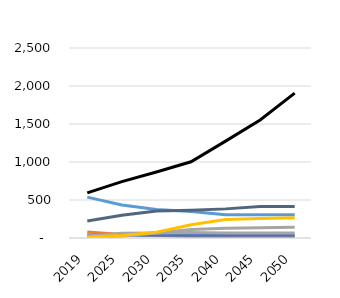
| Category | liquids | natural gas | coal | nuclear | hydro | other | wind | solar |
|---|---|---|---|---|---|---|---|---|
| 2019.0 | 77.92 | 538.19 | 593.2 | 37.21 | 224.79 | 26.84 | 9.54 | 11.95 |
| 2025.0 | 47.72 | 433.59 | 741.6 | 37.27 | 298.81 | 61.18 | 23.06 | 32.98 |
| 2030.0 | 31.63 | 375.12 | 868.62 | 37.27 | 355.27 | 65.64 | 65.27 | 76.94 |
| 2035.0 | 20.73 | 350.22 | 1003 | 37.27 | 364.35 | 71 | 111.89 | 174.43 |
| 2040.0 | 13.36 | 307.42 | 1274.61 | 37.27 | 383.21 | 65.88 | 129.18 | 241.96 |
| 2045.0 | 11.51 | 307.42 | 1552.23 | 37.27 | 414.45 | 65.98 | 135.18 | 256.22 |
| 2050.0 | 11.53 | 307.42 | 1906.9 | 37.27 | 414.45 | 66.09 | 140.77 | 265.64 |